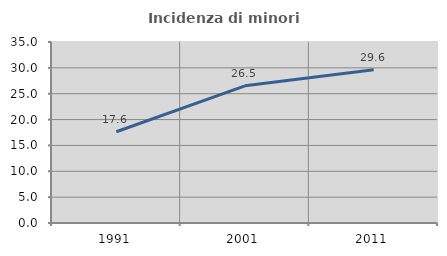
| Category | Incidenza di minori stranieri |
|---|---|
| 1991.0 | 17.647 |
| 2001.0 | 26.519 |
| 2011.0 | 29.64 |